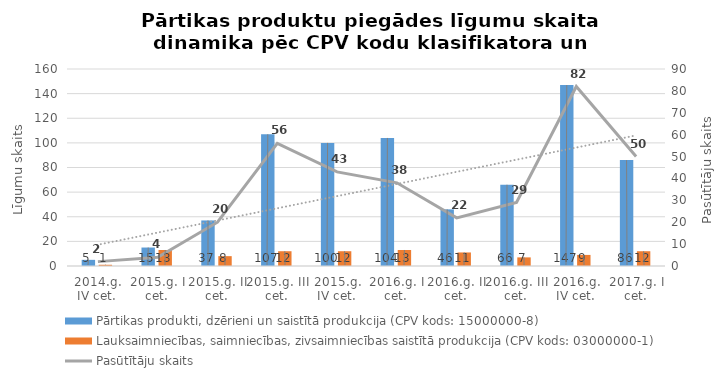
| Category | Pārtikas produkti, dzērieni un saistītā produkcija (CPV kods: 15000000-8) | Lauksaimniecības, saimniecības, zivsaimniecības saistītā produkcija (CPV kods: 03000000-1) |
|---|---|---|
| 2014.g. IV cet. | 5 | 1 |
| 2015.g. I cet. | 15 | 13 |
| 2015.g. II cet. | 37 | 8 |
| 2015.g. III cet. | 107 | 12 |
| 2015.g. IV cet. | 100 | 12 |
| 2016.g. I cet. | 104 | 13 |
| 2016.g. II cet. | 46 | 11 |
| 2016.g. III cet. | 66 | 7 |
| 2016.g. IV cet. | 147 | 9 |
| 2017.g. I cet. | 86 | 12 |